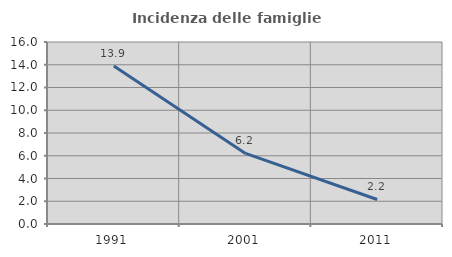
| Category | Incidenza delle famiglie numerose |
|---|---|
| 1991.0 | 13.901 |
| 2001.0 | 6.208 |
| 2011.0 | 2.155 |